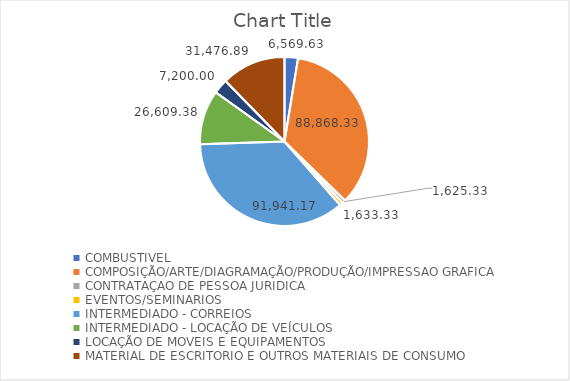
| Category | Series 0 |
|---|---|
| COMBUSTIVEL | 6569.627 |
| COMPOSIÇÃO/ARTE/DIAGRAMAÇÃO/PRODUÇÃO/IMPRESSAO GRAFICA | 88868.333 |
| CONTRATAÇAO DE PESSOA JURIDICA | 1625.333 |
| EVENTOS/SEMINARIOS | 1633.333 |
| INTERMEDIADO - CORREIOS | 91941.167 |
| INTERMEDIADO - LOCAÇÃO DE VEÍCULOS | 26609.383 |
| LOCAÇÃO DE MOVEIS E EQUIPAMENTOS | 7200 |
| MATERIAL DE ESCRITORIO E OUTROS MATERIAIS DE CONSUMO | 31476.887 |